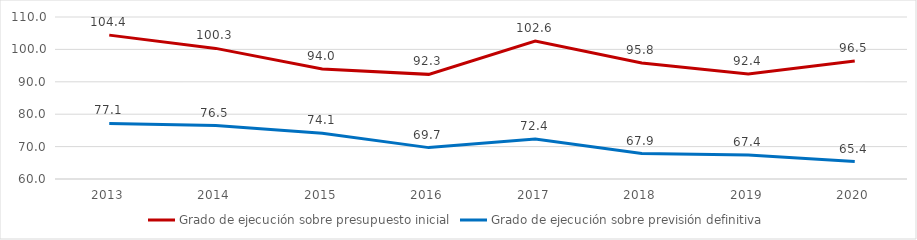
| Category | Grado de ejecución sobre presupuesto inicial | Grado de ejecución sobre previsión definitiva |
|---|---|---|
| 2013.0 | 104.403 | 77.139 |
| 2014.0 | 100.311 | 76.485 |
| 2015.0 | 93.98 | 74.091 |
| 2016.0 | 92.295 | 69.688 |
| 2017.0 | 102.571 | 72.365 |
| 2018.0 | 95.8 | 67.854 |
| 2019.0 | 92.389 | 67.369 |
| 2020.0 | 96.453 | 65.379 |